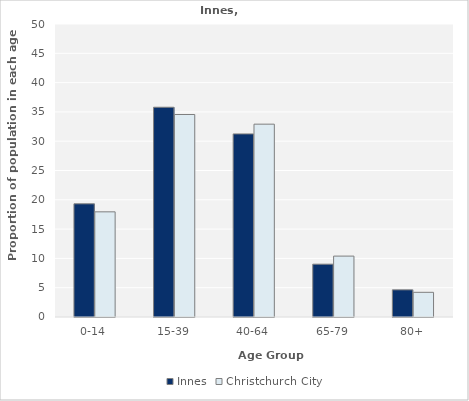
| Category | Innes | Christchurch City |
|---|---|---|
| 0-14 | 19.313 | 17.945 |
| 15-39 | 35.794 | 34.556 |
| 40-64 | 31.245 | 32.907 |
| 65-79 | 9.013 | 10.392 |
| 80+ | 4.635 | 4.211 |